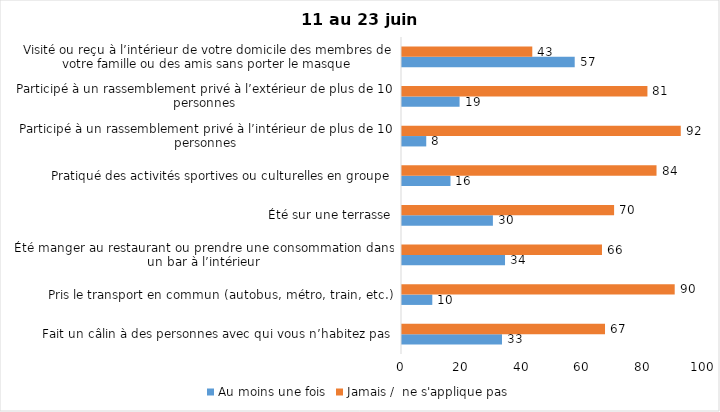
| Category | Au moins une fois | Jamais /  ne s'applique pas |
|---|---|---|
| Fait un câlin à des personnes avec qui vous n’habitez pas | 33 | 67 |
| Pris le transport en commun (autobus, métro, train, etc.) | 10 | 90 |
| Été manger au restaurant ou prendre une consommation dans un bar à l’intérieur | 34 | 66 |
| Été sur une terrasse | 30 | 70 |
| Pratiqué des activités sportives ou culturelles en groupe | 16 | 84 |
| Participé à un rassemblement privé à l’intérieur de plus de 10 personnes | 8 | 92 |
| Participé à un rassemblement privé à l’extérieur de plus de 10 personnes | 19 | 81 |
| Visité ou reçu à l’intérieur de votre domicile des membres de votre famille ou des amis sans porter le masque | 57 | 43 |